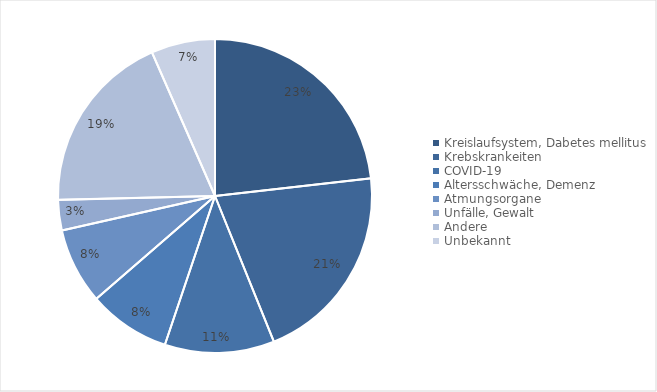
| Category | in % |
|---|---|
| Kreislaufsystem, Dabetes mellitus | 0.232 |
| Krebskrankeiten | 0.207 |
| COVID-19 | 0.113 |
| Altersschwäche, Demenz | 0.085 |
| Atmungsorgane | 0.078 |
| Unfälle, Gewalt | 0.031 |
| Andere | 0.188 |
| Unbekannt | 0.066 |